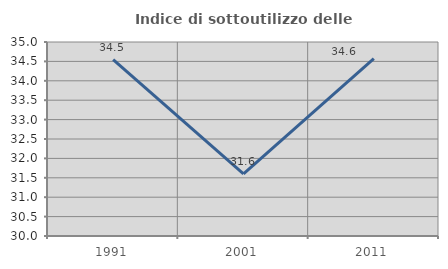
| Category | Indice di sottoutilizzo delle abitazioni  |
|---|---|
| 1991.0 | 34.545 |
| 2001.0 | 31.599 |
| 2011.0 | 34.572 |